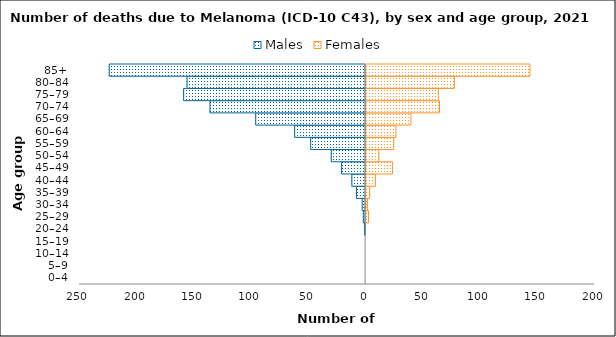
| Category | Males | Females |
|---|---|---|
| 0–4 | 0 | 0 |
| 5–9 | 0 | 0 |
| 10–14 | 0 | 0 |
| 15–19 | 0 | 0 |
| 20–24 | -1 | 0 |
| 25–29 | -2 | 3 |
| 30–34 | -3 | 2 |
| 35–39 | -8 | 4 |
| 40–44 | -12 | 9 |
| 45–49 | -21 | 24 |
| 50–54 | -30 | 12 |
| 55–59 | -48 | 25 |
| 60–64 | -62 | 27 |
| 65–69 | -96 | 40 |
| 70–74 | -136 | 65 |
| 75–79 | -159 | 64 |
| 80–84 | -156 | 78 |
| 85+ | -224 | 144 |